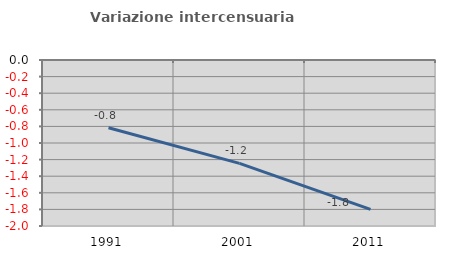
| Category | Variazione intercensuaria annua |
|---|---|
| 1991.0 | -0.817 |
| 2001.0 | -1.246 |
| 2011.0 | -1.799 |